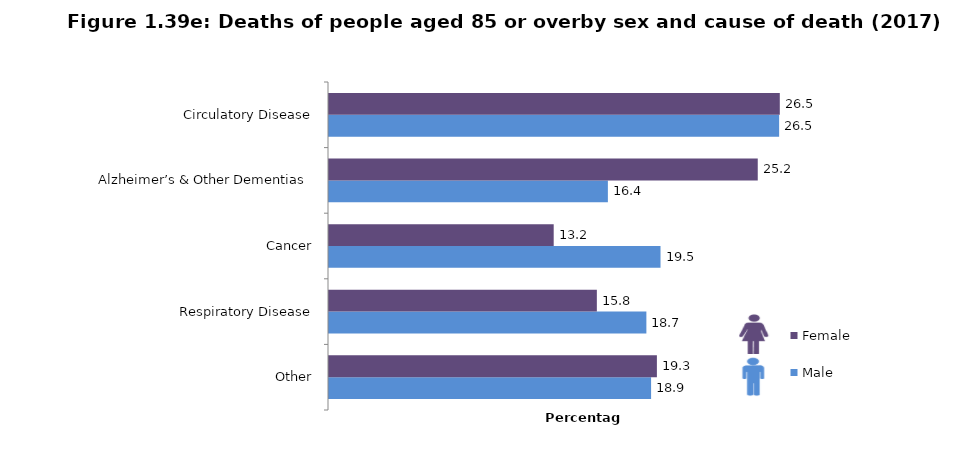
| Category | Male | Female |
|---|---|---|
| Other | 18.946 | 19.288 |
| Respiratory Disease | 18.669 | 15.756 |
| Cancer | 19.501 | 13.217 |
| Alzheimer’s & Other Dementias  | 16.405 | 25.221 |
| Circulatory Disease | 26.479 | 26.518 |